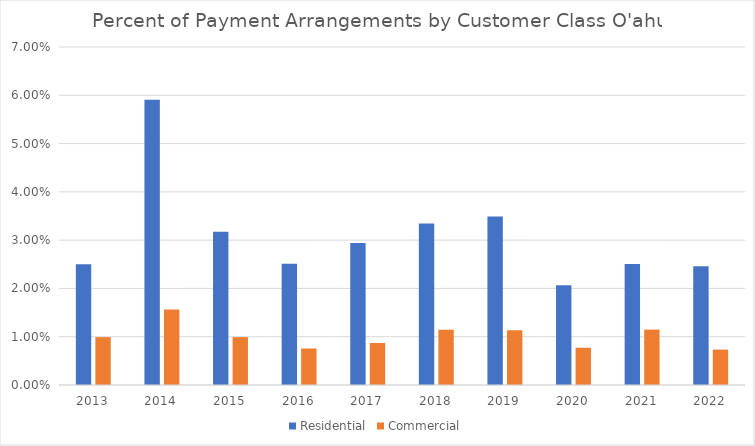
| Category | Residential | Commercial |
|---|---|---|
| 2013.0 | 0.025 | 0.01 |
| 2014.0 | 0.059 | 0.016 |
| 2015.0 | 0.032 | 0.01 |
| 2016.0 | 0.025 | 0.008 |
| 2017.0 | 0.029 | 0.009 |
| 2018.0 | 0.033 | 0.011 |
| 2019.0 | 0.035 | 0.011 |
| 2020.0 | 0.021 | 0.008 |
| 2021.0 | 0.025 | 0.011 |
| 2022.0 | 0.025 | 0.007 |